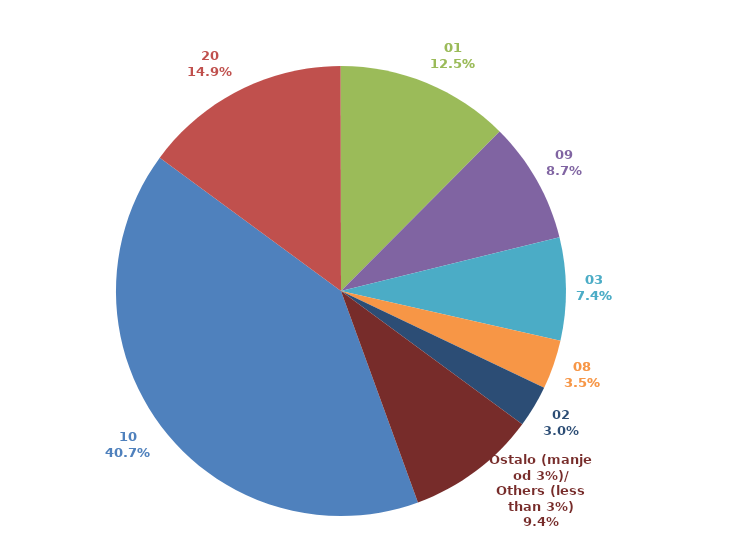
| Category | Series 0 |
|---|---|
| 10 | 0.407 |
| 20 | 0.149 |
| 01 | 0.125 |
| 09 | 0.087 |
| 03 | 0.074 |
| 08 | 0.035 |
| 02 | 0.03 |
| Ostalo (manje od 3%)/
Others (less than 3%) | 0.094 |